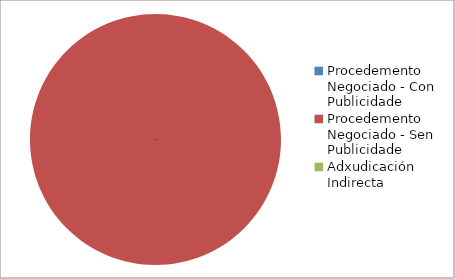
| Category | Series 0 |
|---|---|
| Procedemento Negociado - Con Publicidade | 0 |
| Procedemento Negociado - Sen Publicidade | 1 |
| Adxudicación Indirecta | 0 |